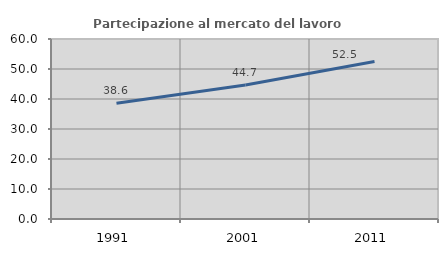
| Category | Partecipazione al mercato del lavoro  femminile |
|---|---|
| 1991.0 | 38.594 |
| 2001.0 | 44.674 |
| 2011.0 | 52.507 |